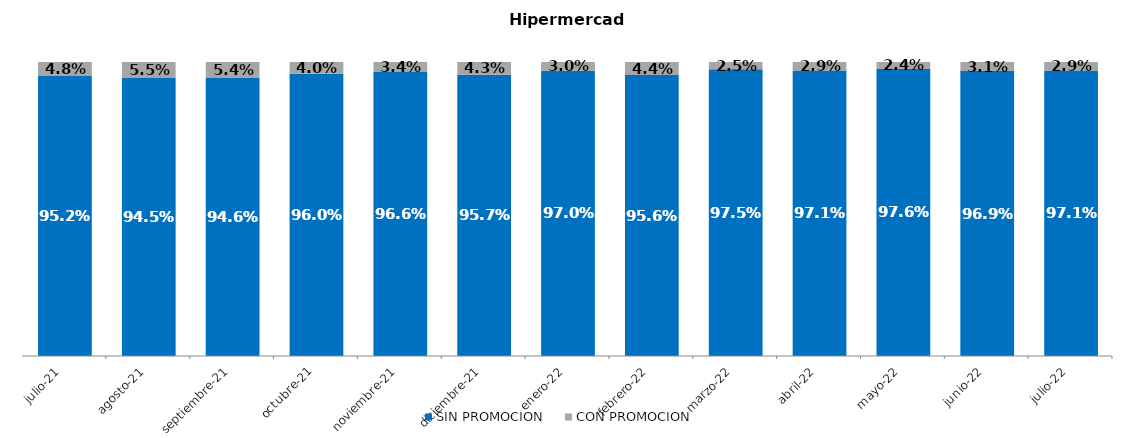
| Category | SIN PROMOCION   | CON PROMOCION   |
|---|---|---|
| 2021-07-01 | 0.952 | 0.048 |
| 2021-08-01 | 0.945 | 0.055 |
| 2021-09-01 | 0.946 | 0.054 |
| 2021-10-01 | 0.96 | 0.04 |
| 2021-11-01 | 0.966 | 0.034 |
| 2021-12-01 | 0.957 | 0.043 |
| 2022-01-01 | 0.97 | 0.03 |
| 2022-02-01 | 0.956 | 0.044 |
| 2022-03-01 | 0.975 | 0.025 |
| 2022-04-01 | 0.971 | 0.029 |
| 2022-05-01 | 0.976 | 0.024 |
| 2022-06-01 | 0.969 | 0.031 |
| 2022-07-01 | 0.971 | 0.029 |